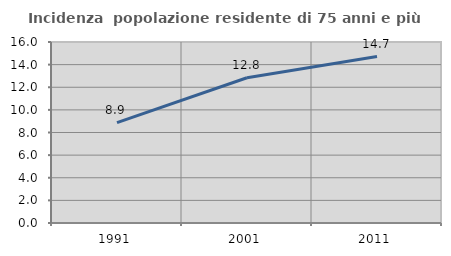
| Category | Incidenza  popolazione residente di 75 anni e più |
|---|---|
| 1991.0 | 8.868 |
| 2001.0 | 12.843 |
| 2011.0 | 14.713 |